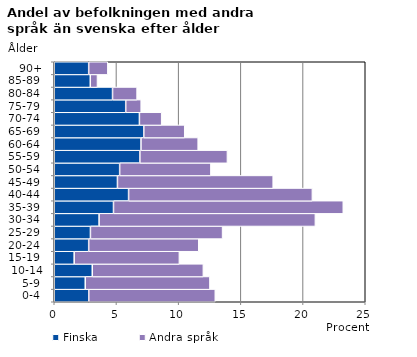
| Category | Finska | Andra språk |
|---|---|---|
|   0-4  | 2.774 | 10.172 |
|   5-9  | 2.491 | 10.023 |
| 10-14 | 3.055 | 8.931 |
| 15-19  | 1.602 | 8.456 |
| 20-24  | 2.769 | 8.846 |
| 25-29  | 2.908 | 10.623 |
| 30-34  | 3.606 | 17.384 |
| 35-39  | 4.762 | 18.472 |
| 40-44  | 5.975 | 14.775 |
| 45-49  | 5.08 | 12.519 |
| 50-54  | 5.258 | 7.334 |
| 55-59  | 6.884 | 7.035 |
| 60-64  | 6.973 | 4.596 |
| 65-69  | 7.198 | 3.29 |
| 70-74  | 6.846 | 1.79 |
| 75-79  | 5.745 | 1.242 |
| 80-84  | 4.686 | 1.973 |
| 85-89  | 2.896 | 0.579 |
| 90+ | 2.769 | 1.538 |